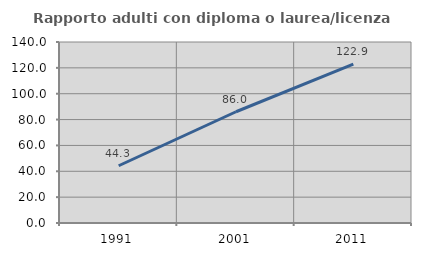
| Category | Rapporto adulti con diploma o laurea/licenza media  |
|---|---|
| 1991.0 | 44.29 |
| 2001.0 | 86.041 |
| 2011.0 | 122.857 |